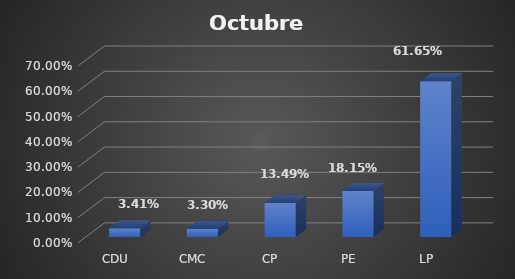
| Category | Series 0 |
|---|---|
| CDU | 0.034 |
| CMC | 0.033 |
| CP | 0.135 |
| PE | 0.181 |
| LP | 0.617 |